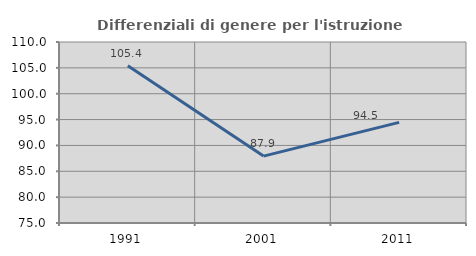
| Category | Differenziali di genere per l'istruzione superiore |
|---|---|
| 1991.0 | 105.387 |
| 2001.0 | 87.936 |
| 2011.0 | 94.459 |